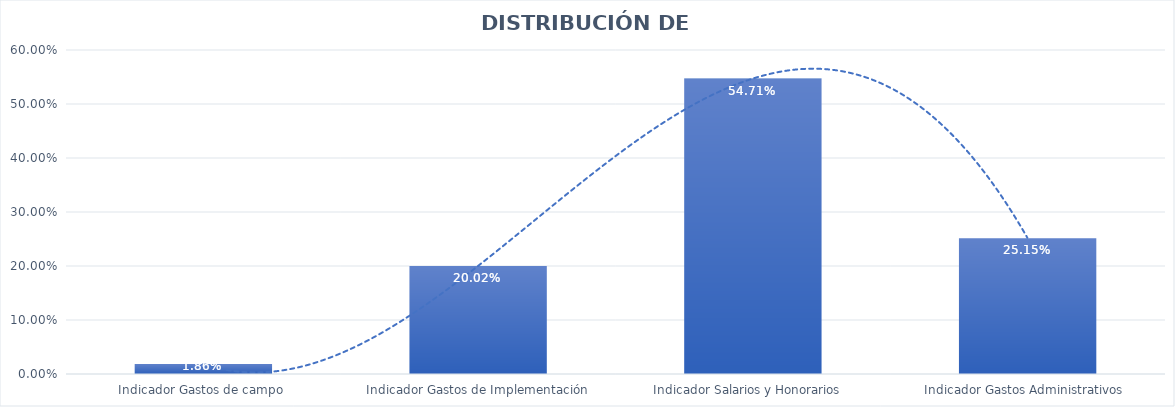
| Category | Series 2 |
|---|---|
| Indicador Gastos de campo  | 0.019 |
| Indicador Gastos de Implementación | 0.2 |
| Indicador Salarios y Honorarios   | 0.547 |
| Indicador Gastos Administrativos  | 0.252 |